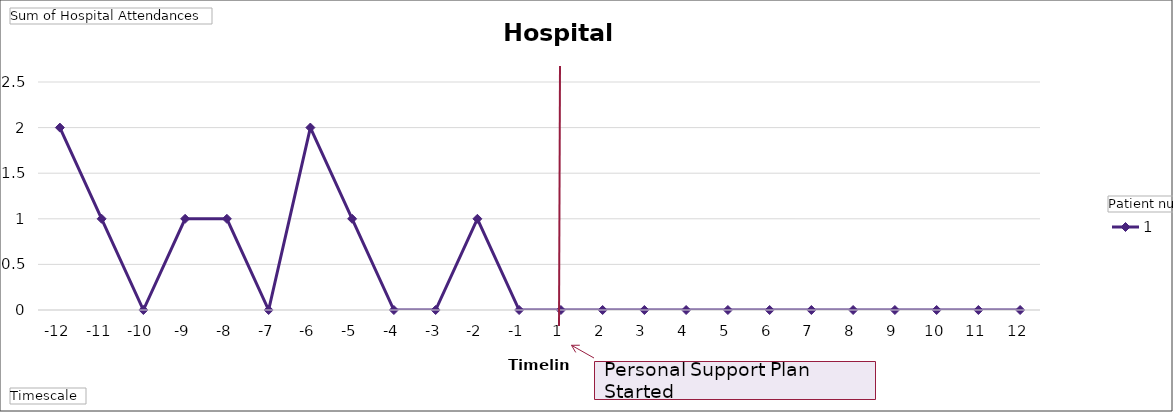
| Category | 1 |
|---|---|
| -12 | 2 |
| -11 | 1 |
| -10 | 0 |
| -9 | 1 |
| -8 | 1 |
| -7 | 0 |
| -6 | 2 |
| -5 | 1 |
| -4 | 0 |
| -3 | 0 |
| -2 | 1 |
| -1 | 0 |
| 1 | 0 |
| 2 | 0 |
| 3 | 0 |
| 4 | 0 |
| 5 | 0 |
| 6 | 0 |
| 7 | 0 |
| 8 | 0 |
| 9 | 0 |
| 10 | 0 |
| 11 | 0 |
| 12 | 0 |